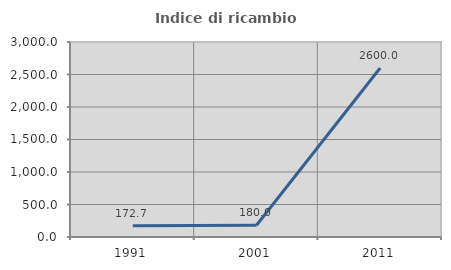
| Category | Indice di ricambio occupazionale  |
|---|---|
| 1991.0 | 172.727 |
| 2001.0 | 180 |
| 2011.0 | 2600 |